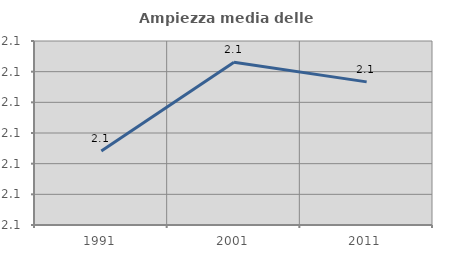
| Category | Ampiezza media delle famiglie |
|---|---|
| 1991.0 | 2.122 |
| 2001.0 | 2.137 |
| 2011.0 | 2.133 |